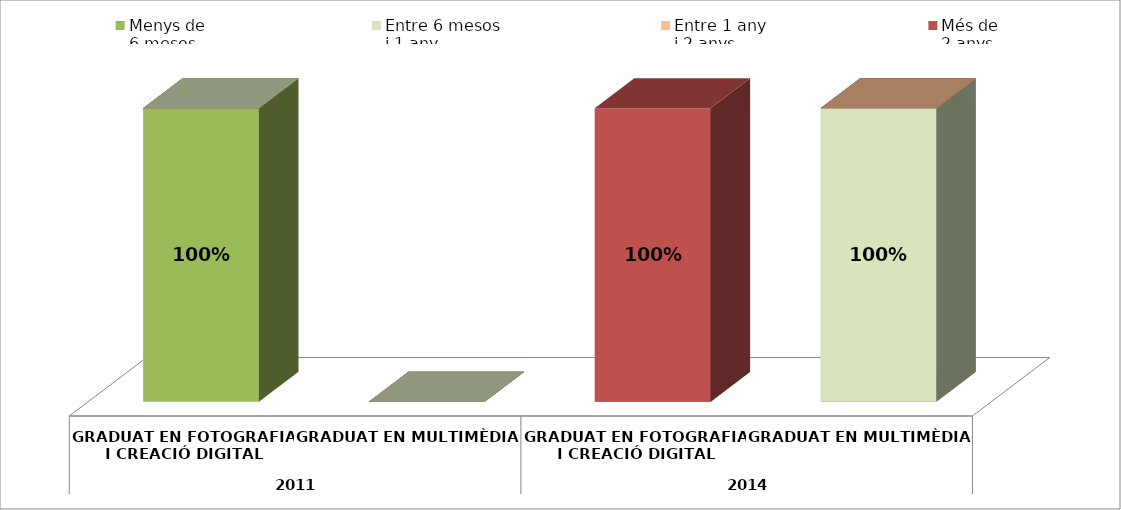
| Category | Menys de 
6 mesos | Entre 6 mesos
i 1 any | Entre 1 any
i 2 anys | Més de
2 anys |
|---|---|---|---|---|
| 0 | 1 | 0 | 0 | 0 |
| 1 | 0 | 0 | 0 | 0 |
| 2 | 0 | 0 | 0 | 1 |
| 3 | 0 | 1 | 0 | 0 |